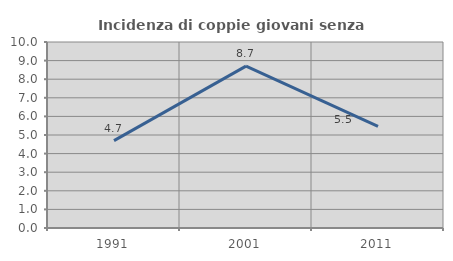
| Category | Incidenza di coppie giovani senza figli |
|---|---|
| 1991.0 | 4.701 |
| 2001.0 | 8.702 |
| 2011.0 | 5.461 |